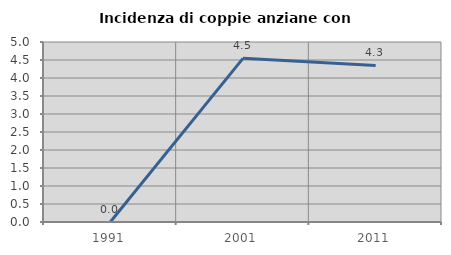
| Category | Incidenza di coppie anziane con figli |
|---|---|
| 1991.0 | 0 |
| 2001.0 | 4.545 |
| 2011.0 | 4.348 |